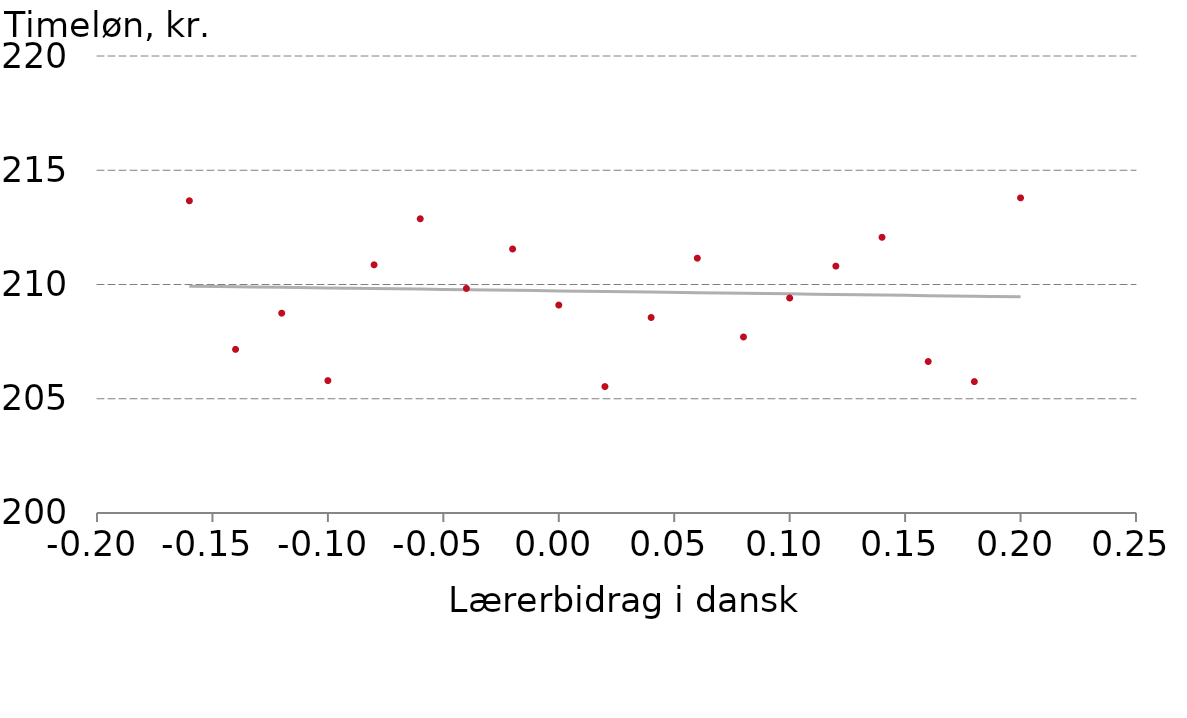
| Category | Predicted timeløn |
|---|---|
| -0.16 | 209.928 |
| -0.14 | 209.902 |
| -0.12 | 209.876 |
| -0.1 | 209.85 |
| -0.08 | 209.824 |
| -0.06 | 209.798 |
| -0.04 | 209.772 |
| -0.02 | 209.746 |
| 0.0 | 209.72 |
| 0.02 | 209.694 |
| 0.04 | 209.668 |
| 0.06 | 209.642 |
| 0.08 | 209.616 |
| 0.1 | 209.59 |
| 0.12 | 209.564 |
| 0.14 | 209.538 |
| 0.16 | 209.512 |
| 0.18 | 209.486 |
| 0.2 | 209.46 |